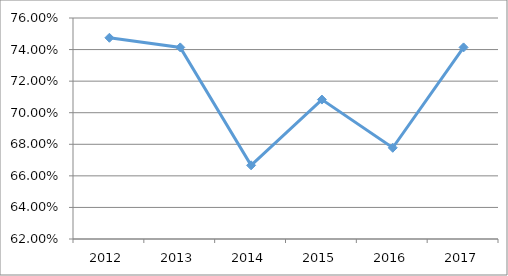
| Category | DIRT-D4O17 |
|---|---|
| 2012.0 | 0.747 |
| 2013.0 | 0.741 |
| 2014.0 | 0.667 |
| 2015.0 | 0.708 |
| 2016.0 | 0.678 |
| 2017.0 | 0.741 |